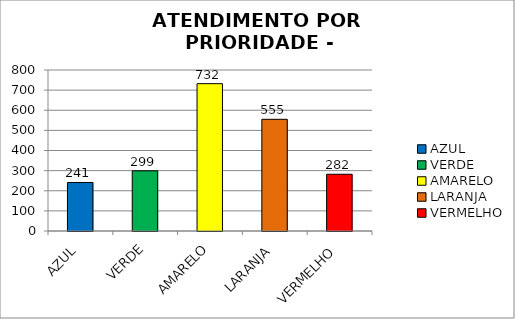
| Category | Total Regional: |
|---|---|
| AZUL | 241 |
| VERDE | 299 |
| AMARELO | 732 |
| LARANJA | 555 |
| VERMELHO | 282 |